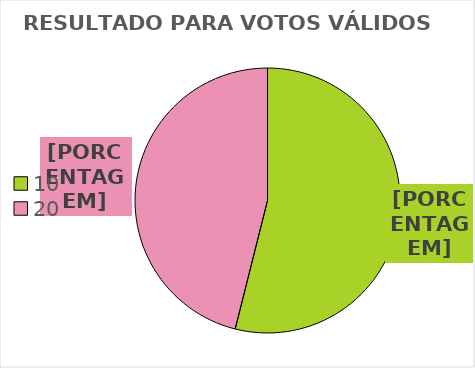
| Category | Series 0 |
|---|---|
| 10.0 | 0.539 |
| 20.0 | 0.461 |